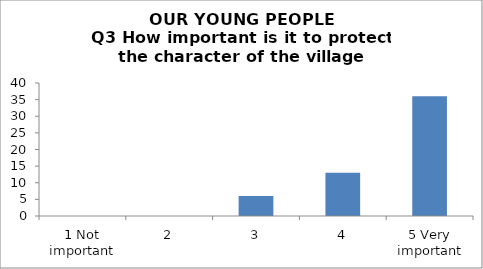
| Category | Series 0 |
|---|---|
| 1 Not important | 0 |
| 2 | 0 |
| 3 | 6 |
| 4 | 13 |
| 5 Very important | 36 |